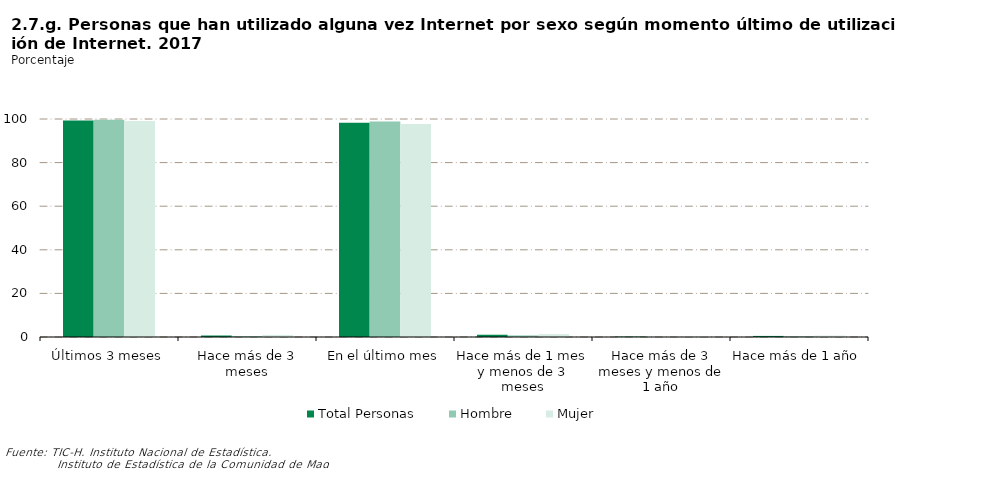
| Category | Total Personas | Hombre | Mujer |
|---|---|---|---|
| Últimos 3 meses | 99.314 | 99.599 | 99.041 |
| Hace más de 3 meses | 0.686 | 0.401 | 0.959 |
| En el último mes | 98.278 | 98.859 | 97.719 |
| Hace más de 1 mes y menos de 3 meses | 1.037 | 0.74 | 1.322 |
| Hace más de 3 meses y menos de 1 año | 0.191 | 0.059 | 0.317 |
| Hace más de 1 año | 0.495 | 0.342 | 0.642 |